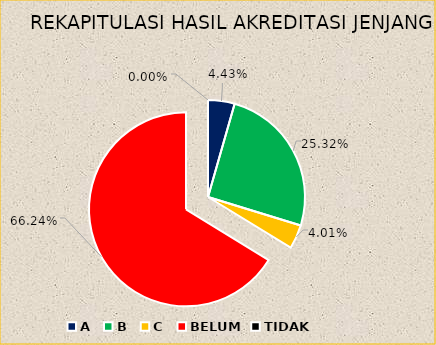
| Category | REKAPITULASI HASIL AKREDITASI JENJANG TK |
|---|---|
| A | 21 |
| B | 120 |
| C | 19 |
| BELUM | 314 |
| TIDAK | 0 |